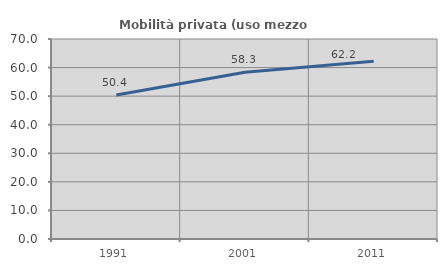
| Category | Mobilità privata (uso mezzo privato) |
|---|---|
| 1991.0 | 50.42 |
| 2001.0 | 58.333 |
| 2011.0 | 62.189 |